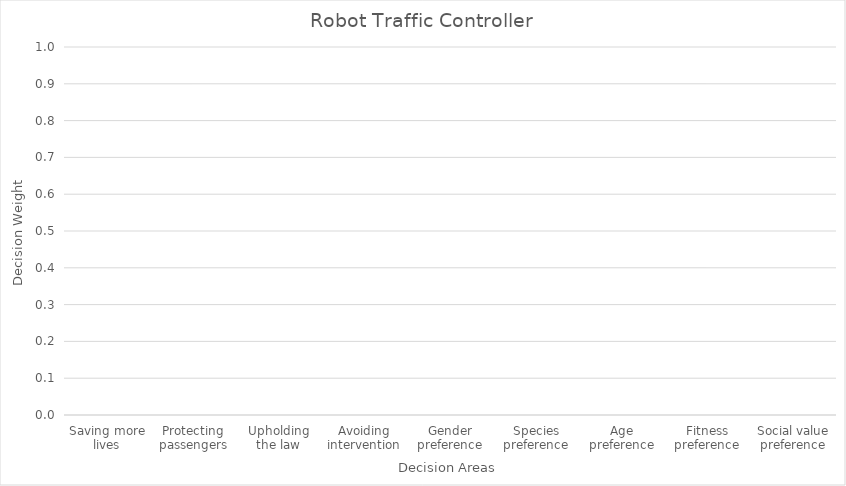
| Category | Decisions |
|---|---|
| Saving more lives | 0 |
| Protecting passengers | 0 |
| Upholding the law | 0 |
| Avoiding intervention | 0 |
| Gender preference | 0 |
| Species preference | 0 |
| Age preference | 0 |
| Fitness preference | 0 |
| Social value preference | 0 |